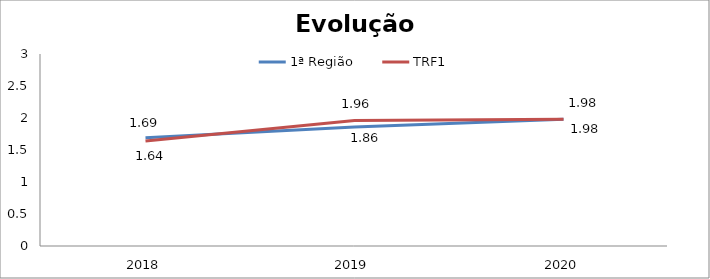
| Category | 1ª Região | TRF1 |
|---|---|---|
| 0 | 1.69 | 1.64 |
| 1 | 1.86 | 1.96 |
| 2 | 1.98 | 1.98 |